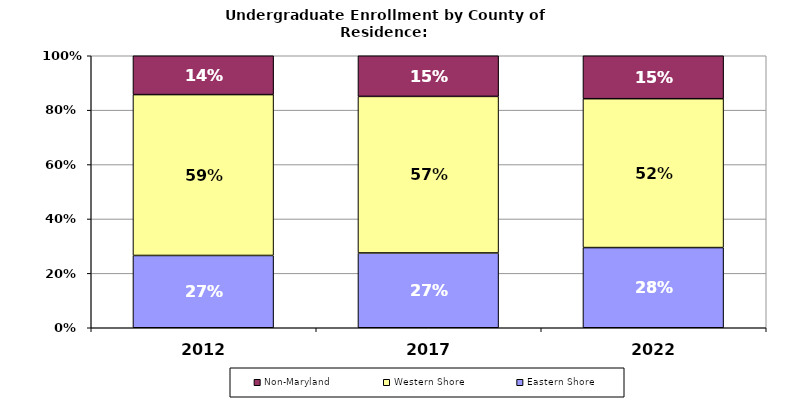
| Category | Eastern Shore | Western Shore | Non-Maryland |
|---|---|---|---|
| 2012.0 | 0.266 | 0.591 | 0.143 |
| 2017.0 | 0.273 | 0.571 | 0.148 |
| 2022.0 | 0.281 | 0.521 | 0.15 |